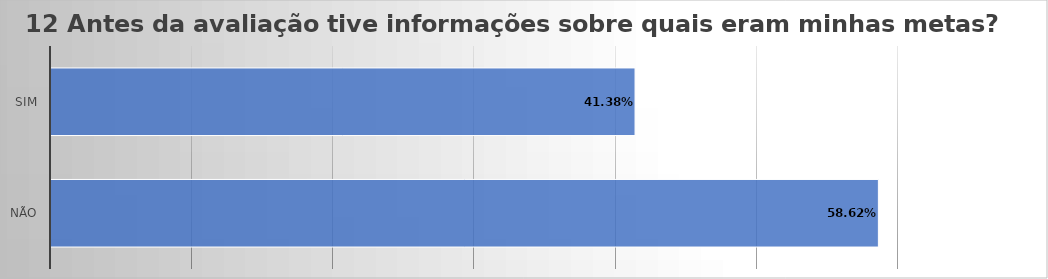
| Category | 12 Antes da avaliação tive informações sobre quais eram minhas metas? |
|---|---|
| Não | 0.586 |
| Sim | 0.414 |